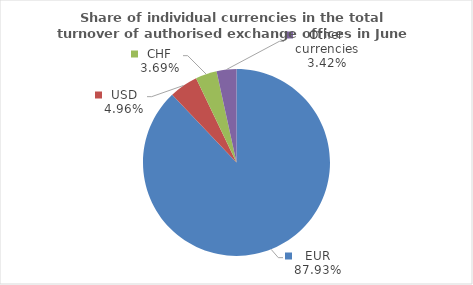
| Category | Series 0 |
|---|---|
| EUR | 87.925 |
| USD | 4.958 |
| CHF | 3.693 |
| Other currencies | 3.424 |